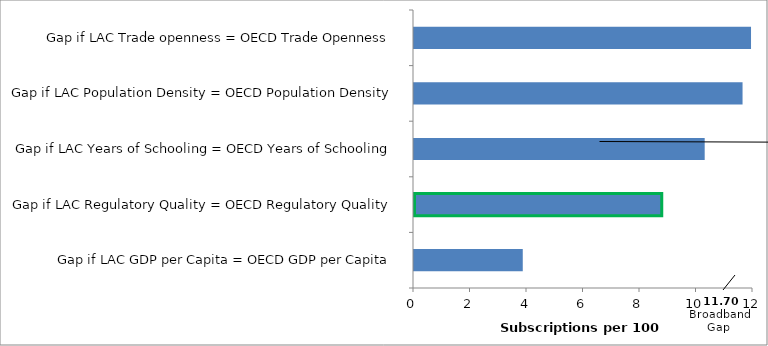
| Category | Series 0 |
|---|---|
| Gap if LAC GDP per Capita = OECD GDP per Capita | 3.85 |
| Gap if LAC Regulatory Quality = OECD Regulatory Quality | 8.77 |
| Gap if LAC Years of Schooling = OECD Years of Schooling | 10.29 |
| Gap if LAC Population Density = OECD Population Density | 11.63 |
| Gap if LAC Trade openness = OECD Trade Openness | 11.93 |